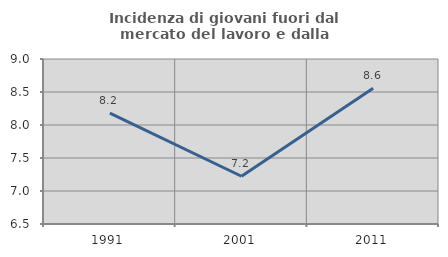
| Category | Incidenza di giovani fuori dal mercato del lavoro e dalla formazione  |
|---|---|
| 1991.0 | 8.179 |
| 2001.0 | 7.224 |
| 2011.0 | 8.557 |